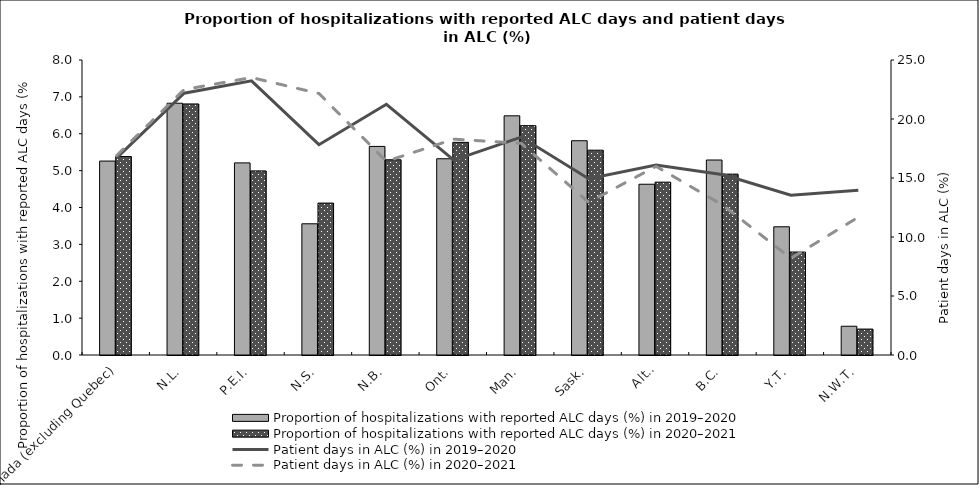
| Category | Proportion of hospitalizations with reported ALC days (%) in 2019–2020 | Proportion of hospitalizations with reported ALC days (%) in 2020–2021 |
|---|---|---|
| Canada (excluding Quebec) | 5.259 | 5.382 |
| N.L. | 6.828 | 6.809 |
| P.E.I. | 5.21 | 4.993 |
| N.S. | 3.558 | 4.12 |
| N.B. | 5.656 | 5.295 |
| Ont. | 5.322 | 5.767 |
| Man. | 6.486 | 6.22 |
| Sask. | 5.811 | 5.554 |
| Alta. | 4.631 | 4.688 |
| B.C. | 5.288 | 4.905 |
| Y.T. | 3.477 | 2.792 |
| N.W.T. | 0.78 | 0.703 |